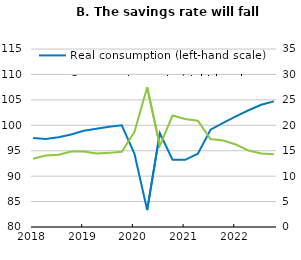
| Category | Real consumption (left-hand scale) |
|---|---|
| 2018-01-01 | 97.508 |
| 2018-04-01 | 97.327 |
| 2018-07-01 | 97.638 |
| 2018-10-01 | 98.186 |
| 2019-01-01 | 98.909 |
| 2019-04-01 | 99.302 |
| 2019-07-01 | 99.716 |
| 2019-10-01 | 100 |
| 2020-01-01 | 94.37 |
| 2020-04-01 | 83.326 |
| 2020-07-01 | 98.468 |
| 2020-10-01 | 93.241 |
| 2021-01-01 | 93.202 |
| 2021-04-01 | 94.408 |
| 2021-07-01 | 99.138 |
| 2021-10-01 | 100.476 |
| 2022-01-01 | 101.752 |
| 2022-04-01 | 102.953 |
| 2022-07-01 | 104.026 |
| 2022-10-01 | 104.697 |